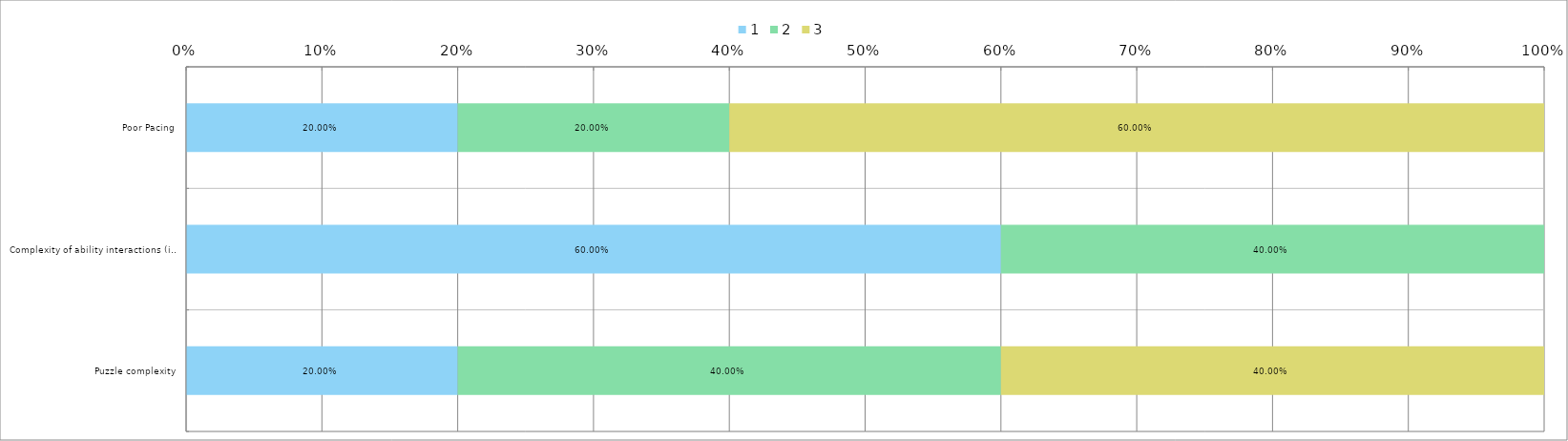
| Category | 1 | 2 | 3 |
|---|---|---|---|
| 0 | 0.2 | 0.2 | 0.6 |
| 1 | 0.6 | 0.4 | 0 |
| 2 | 0.2 | 0.4 | 0.4 |